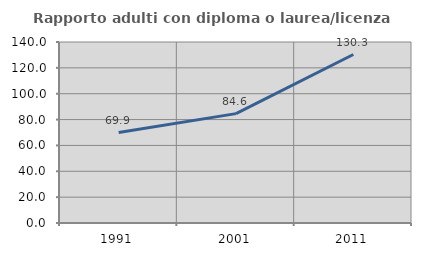
| Category | Rapporto adulti con diploma o laurea/licenza media  |
|---|---|
| 1991.0 | 69.942 |
| 2001.0 | 84.588 |
| 2011.0 | 130.323 |